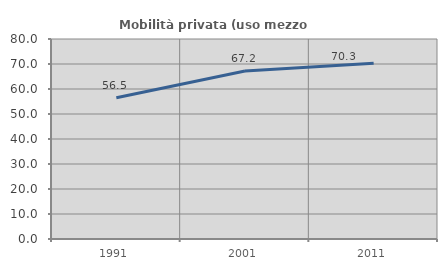
| Category | Mobilità privata (uso mezzo privato) |
|---|---|
| 1991.0 | 56.481 |
| 2001.0 | 67.227 |
| 2011.0 | 70.344 |